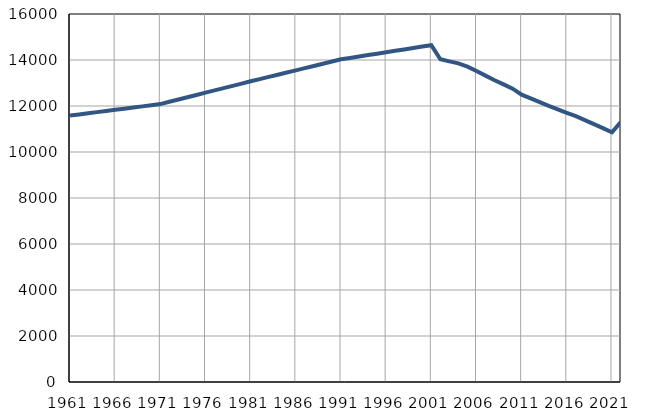
| Category | Population
size |
|---|---|
| 1961.0 | 11583 |
| 1962.0 | 11633 |
| 1963.0 | 11683 |
| 1964.0 | 11733 |
| 1965.0 | 11783 |
| 1966.0 | 11834 |
| 1967.0 | 11884 |
| 1968.0 | 11934 |
| 1969.0 | 11984 |
| 1970.0 | 12034 |
| 1971.0 | 12084 |
| 1972.0 | 12183 |
| 1973.0 | 12282 |
| 1974.0 | 12381 |
| 1975.0 | 12480 |
| 1976.0 | 12579 |
| 1977.0 | 12678 |
| 1978.0 | 12777 |
| 1979.0 | 12875 |
| 1980.0 | 12974 |
| 1981.0 | 13074 |
| 1982.0 | 13170 |
| 1983.0 | 13265 |
| 1984.0 | 13360 |
| 1985.0 | 13455 |
| 1986.0 | 13551 |
| 1987.0 | 13647 |
| 1988.0 | 13742 |
| 1989.0 | 13838 |
| 1990.0 | 13934 |
| 1991.0 | 14029 |
| 1992.0 | 14091 |
| 1993.0 | 14152 |
| 1994.0 | 14214 |
| 1995.0 | 14275 |
| 1996.0 | 14337 |
| 1997.0 | 14398 |
| 1998.0 | 14460 |
| 1999.0 | 14521 |
| 2000.0 | 14583 |
| 2001.0 | 14644 |
| 2002.0 | 14033 |
| 2003.0 | 13942 |
| 2004.0 | 13854 |
| 2005.0 | 13709 |
| 2006.0 | 13521 |
| 2007.0 | 13320 |
| 2008.0 | 13121 |
| 2009.0 | 12940 |
| 2010.0 | 12752 |
| 2011.0 | 12492 |
| 2012.0 | 12335 |
| 2013.0 | 12169 |
| 2014.0 | 12005 |
| 2015.0 | 11853 |
| 2016.0 | 11706 |
| 2017.0 | 11559 |
| 2018.0 | 11387 |
| 2019.0 | 11211 |
| 2020.0 | 11035 |
| 2021.0 | 10860 |
| 2022.0 | 11314 |